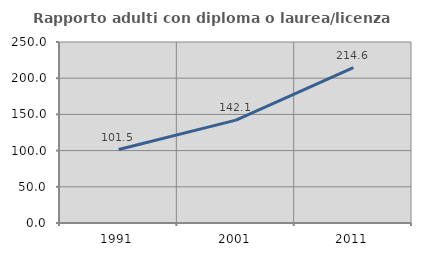
| Category | Rapporto adulti con diploma o laurea/licenza media  |
|---|---|
| 1991.0 | 101.49 |
| 2001.0 | 142.088 |
| 2011.0 | 214.553 |